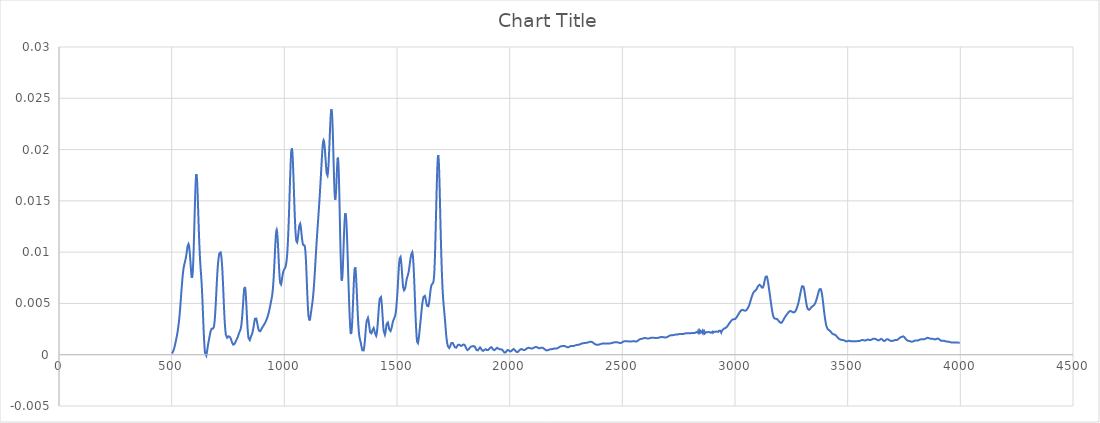
| Category | Series 0 |
|---|---|
| 3997.70514 | 0.001 |
| 3995.77668 | 0.001 |
| 3993.84822 | 0.001 |
| 3991.91975 | 0.001 |
| 3989.99129 | 0.001 |
| 3988.06283 | 0.001 |
| 3986.13436 | 0.001 |
| 3984.2059 | 0.001 |
| 3982.27743 | 0.001 |
| 3980.34897 | 0.001 |
| 3978.42051 | 0.001 |
| 3976.49204 | 0.001 |
| 3974.56358 | 0.001 |
| 3972.63512 | 0.001 |
| 3970.70665 | 0.001 |
| 3968.77819 | 0.001 |
| 3966.84973 | 0.001 |
| 3964.92126 | 0.001 |
| 3962.9928 | 0.001 |
| 3961.06433 | 0.001 |
| 3959.13587 | 0.001 |
| 3957.20741 | 0.001 |
| 3955.27894 | 0.001 |
| 3953.35048 | 0.001 |
| 3951.42202 | 0.001 |
| 3949.49355 | 0.001 |
| 3947.56509 | 0.001 |
| 3945.63663 | 0.001 |
| 3943.70816 | 0.001 |
| 3941.7797 | 0.001 |
| 3939.85123 | 0.001 |
| 3937.92277 | 0.001 |
| 3935.99431 | 0.001 |
| 3934.06584 | 0.001 |
| 3932.13738 | 0.001 |
| 3930.20892 | 0.001 |
| 3928.28045 | 0.001 |
| 3926.35199 | 0.001 |
| 3924.42353 | 0.001 |
| 3922.49506 | 0.001 |
| 3920.5666 | 0.001 |
| 3918.63813 | 0.001 |
| 3916.70967 | 0.001 |
| 3914.78121 | 0.001 |
| 3912.85274 | 0.001 |
| 3910.92428 | 0.001 |
| 3908.99582 | 0.001 |
| 3907.06735 | 0.001 |
| 3905.13889 | 0.002 |
| 3903.21043 | 0.002 |
| 3901.28196 | 0.002 |
| 3899.3535 | 0.002 |
| 3897.42503 | 0.002 |
| 3895.49657 | 0.002 |
| 3893.56811 | 0.002 |
| 3891.63964 | 0.002 |
| 3889.71118 | 0.001 |
| 3887.78272 | 0.001 |
| 3885.85425 | 0.001 |
| 3883.92579 | 0.002 |
| 3881.99733 | 0.002 |
| 3880.06886 | 0.002 |
| 3878.1404 | 0.002 |
| 3876.21193 | 0.002 |
| 3874.28347 | 0.002 |
| 3872.35501 | 0.002 |
| 3870.42654 | 0.002 |
| 3868.49808 | 0.002 |
| 3866.56962 | 0.002 |
| 3864.64115 | 0.002 |
| 3862.71269 | 0.002 |
| 3860.78422 | 0.002 |
| 3858.85576 | 0.002 |
| 3856.9273 | 0.002 |
| 3854.99883 | 0.002 |
| 3853.07037 | 0.002 |
| 3851.14191 | 0.002 |
| 3849.21344 | 0.002 |
| 3847.28498 | 0.002 |
| 3845.35652 | 0.002 |
| 3843.42805 | 0.002 |
| 3841.49959 | 0.002 |
| 3839.57112 | 0.002 |
| 3837.64266 | 0.001 |
| 3835.7142 | 0.001 |
| 3833.78573 | 0.001 |
| 3831.85727 | 0.001 |
| 3829.92881 | 0.002 |
| 3828.00034 | 0.002 |
| 3826.07188 | 0.002 |
| 3824.14342 | 0.001 |
| 3822.21495 | 0.001 |
| 3820.28649 | 0.001 |
| 3818.35802 | 0.001 |
| 3816.42956 | 0.001 |
| 3814.5011 | 0.001 |
| 3812.57263 | 0.001 |
| 3810.64417 | 0.001 |
| 3808.71571 | 0.001 |
| 3806.78724 | 0.001 |
| 3804.85878 | 0.001 |
| 3802.93032 | 0.001 |
| 3801.00185 | 0.001 |
| 3799.07339 | 0.001 |
| 3797.14492 | 0.001 |
| 3795.21646 | 0.001 |
| 3793.288 | 0.001 |
| 3791.35953 | 0.001 |
| 3789.43107 | 0.001 |
| 3787.50261 | 0.001 |
| 3785.57414 | 0.001 |
| 3783.64568 | 0.001 |
| 3781.71722 | 0.001 |
| 3779.78875 | 0.001 |
| 3777.86029 | 0.001 |
| 3775.93182 | 0.001 |
| 3774.00336 | 0.001 |
| 3772.0749 | 0.001 |
| 3770.14643 | 0.001 |
| 3768.21797 | 0.001 |
| 3766.28951 | 0.001 |
| 3764.36104 | 0.001 |
| 3762.43258 | 0.001 |
| 3760.50412 | 0.001 |
| 3758.57565 | 0.002 |
| 3756.64719 | 0.002 |
| 3754.71872 | 0.002 |
| 3752.79026 | 0.002 |
| 3750.8618 | 0.002 |
| 3748.93333 | 0.002 |
| 3747.00487 | 0.002 |
| 3745.07641 | 0.002 |
| 3743.14794 | 0.002 |
| 3741.21948 | 0.002 |
| 3739.29102 | 0.002 |
| 3737.36255 | 0.002 |
| 3735.43409 | 0.002 |
| 3733.50562 | 0.002 |
| 3731.57716 | 0.002 |
| 3729.6487 | 0.002 |
| 3727.72023 | 0.002 |
| 3725.79177 | 0.002 |
| 3723.86331 | 0.001 |
| 3721.93484 | 0.001 |
| 3720.00638 | 0.001 |
| 3718.07791 | 0.001 |
| 3716.14945 | 0.001 |
| 3714.22099 | 0.001 |
| 3712.29252 | 0.001 |
| 3710.36406 | 0.001 |
| 3708.4356 | 0.001 |
| 3706.50713 | 0.001 |
| 3704.57867 | 0.001 |
| 3702.65021 | 0.001 |
| 3700.72174 | 0.001 |
| 3698.79328 | 0.001 |
| 3696.86481 | 0.001 |
| 3694.93635 | 0.001 |
| 3693.00789 | 0.001 |
| 3691.07942 | 0.001 |
| 3689.15096 | 0.001 |
| 3687.2225 | 0.001 |
| 3685.29403 | 0.001 |
| 3683.36557 | 0.001 |
| 3681.43711 | 0.001 |
| 3679.50864 | 0.001 |
| 3677.58018 | 0.002 |
| 3675.65171 | 0.002 |
| 3673.72325 | 0.002 |
| 3671.79479 | 0.001 |
| 3669.86632 | 0.001 |
| 3667.93786 | 0.001 |
| 3666.0094 | 0.001 |
| 3664.08093 | 0.001 |
| 3662.15247 | 0.001 |
| 3660.22401 | 0.001 |
| 3658.29554 | 0.001 |
| 3656.36708 | 0.001 |
| 3654.43861 | 0.001 |
| 3652.51015 | 0.002 |
| 3650.58169 | 0.002 |
| 3648.65322 | 0.002 |
| 3646.72476 | 0.002 |
| 3644.7963 | 0.002 |
| 3642.86783 | 0.001 |
| 3640.93937 | 0.001 |
| 3639.01091 | 0.001 |
| 3637.08244 | 0.001 |
| 3635.15398 | 0.001 |
| 3633.22551 | 0.001 |
| 3631.29705 | 0.001 |
| 3629.36859 | 0.001 |
| 3627.44012 | 0.001 |
| 3625.51166 | 0.002 |
| 3623.5832 | 0.002 |
| 3621.65473 | 0.002 |
| 3619.72627 | 0.002 |
| 3617.79781 | 0.002 |
| 3615.86934 | 0.002 |
| 3613.94088 | 0.002 |
| 3612.01241 | 0.002 |
| 3610.08395 | 0.002 |
| 3608.15549 | 0.002 |
| 3606.22702 | 0.001 |
| 3604.29856 | 0.001 |
| 3602.3701 | 0.001 |
| 3600.44163 | 0.001 |
| 3598.51317 | 0.001 |
| 3596.58471 | 0.001 |
| 3594.65624 | 0.001 |
| 3592.72778 | 0.001 |
| 3590.79931 | 0.001 |
| 3588.87085 | 0.001 |
| 3586.94239 | 0.001 |
| 3585.01392 | 0.001 |
| 3583.08546 | 0.001 |
| 3581.157 | 0.001 |
| 3579.22853 | 0.001 |
| 3577.30007 | 0.001 |
| 3575.3716 | 0.001 |
| 3573.44314 | 0.001 |
| 3571.51468 | 0.001 |
| 3569.58621 | 0.001 |
| 3567.65775 | 0.001 |
| 3565.72929 | 0.001 |
| 3563.80082 | 0.001 |
| 3561.87236 | 0.001 |
| 3559.9439 | 0.001 |
| 3558.01543 | 0.001 |
| 3556.08697 | 0.001 |
| 3554.1585 | 0.001 |
| 3552.23004 | 0.001 |
| 3550.30158 | 0.001 |
| 3548.37311 | 0.001 |
| 3546.44465 | 0.001 |
| 3544.51619 | 0.001 |
| 3542.58772 | 0.001 |
| 3540.65926 | 0.001 |
| 3538.7308 | 0.001 |
| 3536.80233 | 0.001 |
| 3534.87387 | 0.001 |
| 3532.9454 | 0.001 |
| 3531.01694 | 0.001 |
| 3529.08848 | 0.001 |
| 3527.16001 | 0.001 |
| 3525.23155 | 0.001 |
| 3523.30309 | 0.001 |
| 3521.37462 | 0.001 |
| 3519.44616 | 0.001 |
| 3517.5177 | 0.001 |
| 3515.58923 | 0.001 |
| 3513.66077 | 0.001 |
| 3511.7323 | 0.001 |
| 3509.80384 | 0.001 |
| 3507.87538 | 0.001 |
| 3505.94691 | 0.001 |
| 3504.01845 | 0.001 |
| 3502.08999 | 0.001 |
| 3500.16152 | 0.001 |
| 3498.23306 | 0.001 |
| 3496.3046 | 0.001 |
| 3494.37613 | 0.001 |
| 3492.44767 | 0.001 |
| 3490.5192 | 0.001 |
| 3488.59074 | 0.001 |
| 3486.66228 | 0.001 |
| 3484.73381 | 0.001 |
| 3482.80535 | 0.001 |
| 3480.87689 | 0.001 |
| 3478.94842 | 0.001 |
| 3477.01996 | 0.001 |
| 3475.0915 | 0.001 |
| 3473.16303 | 0.001 |
| 3471.23457 | 0.001 |
| 3469.3061 | 0.001 |
| 3467.37764 | 0.001 |
| 3465.44918 | 0.001 |
| 3463.52071 | 0.002 |
| 3461.59225 | 0.002 |
| 3459.66379 | 0.002 |
| 3457.73532 | 0.002 |
| 3455.80686 | 0.002 |
| 3453.8784 | 0.002 |
| 3451.94993 | 0.002 |
| 3450.02147 | 0.002 |
| 3448.093 | 0.002 |
| 3446.16454 | 0.002 |
| 3444.23608 | 0.002 |
| 3442.30761 | 0.002 |
| 3440.37915 | 0.002 |
| 3438.45069 | 0.002 |
| 3436.52222 | 0.002 |
| 3434.59376 | 0.002 |
| 3432.66529 | 0.002 |
| 3430.73683 | 0.002 |
| 3428.80837 | 0.002 |
| 3426.8799 | 0.002 |
| 3424.95144 | 0.002 |
| 3423.02298 | 0.002 |
| 3421.09451 | 0.002 |
| 3419.16605 | 0.002 |
| 3417.23759 | 0.002 |
| 3415.30912 | 0.002 |
| 3413.38066 | 0.002 |
| 3411.45219 | 0.002 |
| 3409.52373 | 0.003 |
| 3407.59527 | 0.003 |
| 3405.6668 | 0.003 |
| 3403.73834 | 0.003 |
| 3401.80988 | 0.003 |
| 3399.88141 | 0.003 |
| 3397.95295 | 0.004 |
| 3396.02449 | 0.004 |
| 3394.09602 | 0.004 |
| 3392.16756 | 0.005 |
| 3390.23909 | 0.005 |
| 3388.31063 | 0.006 |
| 3386.38217 | 0.006 |
| 3384.4537 | 0.006 |
| 3382.52524 | 0.006 |
| 3380.59678 | 0.006 |
| 3378.66831 | 0.006 |
| 3376.73985 | 0.006 |
| 3374.81139 | 0.006 |
| 3372.88292 | 0.006 |
| 3370.95446 | 0.006 |
| 3369.02599 | 0.006 |
| 3367.09753 | 0.006 |
| 3365.16907 | 0.006 |
| 3363.2406 | 0.006 |
| 3361.31214 | 0.005 |
| 3359.38368 | 0.005 |
| 3357.45521 | 0.005 |
| 3355.52675 | 0.005 |
| 3353.59829 | 0.005 |
| 3351.66982 | 0.005 |
| 3349.74136 | 0.005 |
| 3347.81289 | 0.005 |
| 3345.88443 | 0.005 |
| 3343.95597 | 0.005 |
| 3342.0275 | 0.005 |
| 3340.09904 | 0.005 |
| 3338.17058 | 0.005 |
| 3336.24211 | 0.005 |
| 3334.31365 | 0.004 |
| 3332.38519 | 0.004 |
| 3330.45672 | 0.004 |
| 3328.52826 | 0.004 |
| 3326.59979 | 0.004 |
| 3324.67133 | 0.004 |
| 3322.74287 | 0.004 |
| 3320.8144 | 0.005 |
| 3318.88594 | 0.005 |
| 3316.95748 | 0.005 |
| 3315.02901 | 0.005 |
| 3313.10055 | 0.006 |
| 3311.17208 | 0.006 |
| 3309.24362 | 0.006 |
| 3307.31516 | 0.006 |
| 3305.38669 | 0.007 |
| 3303.45823 | 0.007 |
| 3301.52977 | 0.007 |
| 3299.6013 | 0.007 |
| 3297.67284 | 0.007 |
| 3295.74438 | 0.007 |
| 3293.81591 | 0.006 |
| 3291.88745 | 0.006 |
| 3289.95898 | 0.006 |
| 3288.03052 | 0.006 |
| 3286.10206 | 0.006 |
| 3284.17359 | 0.005 |
| 3282.24513 | 0.005 |
| 3280.31667 | 0.005 |
| 3278.3882 | 0.005 |
| 3276.45974 | 0.005 |
| 3274.53128 | 0.005 |
| 3272.60281 | 0.004 |
| 3270.67435 | 0.004 |
| 3268.74588 | 0.004 |
| 3266.81742 | 0.004 |
| 3264.88896 | 0.004 |
| 3262.96049 | 0.004 |
| 3261.03203 | 0.004 |
| 3259.10357 | 0.004 |
| 3257.1751 | 0.004 |
| 3255.24664 | 0.004 |
| 3253.31818 | 0.004 |
| 3251.38971 | 0.004 |
| 3249.46125 | 0.004 |
| 3247.53278 | 0.004 |
| 3245.60432 | 0.004 |
| 3243.67586 | 0.004 |
| 3241.74739 | 0.004 |
| 3239.81893 | 0.004 |
| 3237.89047 | 0.004 |
| 3235.962 | 0.004 |
| 3234.03354 | 0.004 |
| 3232.10508 | 0.004 |
| 3230.17661 | 0.004 |
| 3228.24815 | 0.004 |
| 3226.31968 | 0.004 |
| 3224.39122 | 0.004 |
| 3222.46276 | 0.004 |
| 3220.53429 | 0.004 |
| 3218.60583 | 0.004 |
| 3216.67737 | 0.003 |
| 3214.7489 | 0.003 |
| 3212.82044 | 0.003 |
| 3210.89198 | 0.003 |
| 3208.96351 | 0.003 |
| 3207.03505 | 0.003 |
| 3205.10658 | 0.003 |
| 3203.17812 | 0.003 |
| 3201.24966 | 0.003 |
| 3199.32119 | 0.003 |
| 3197.39273 | 0.003 |
| 3195.46427 | 0.003 |
| 3193.5358 | 0.003 |
| 3191.60734 | 0.003 |
| 3189.67888 | 0.003 |
| 3187.75041 | 0.003 |
| 3185.82195 | 0.003 |
| 3183.89348 | 0.004 |
| 3181.96502 | 0.004 |
| 3180.03656 | 0.004 |
| 3178.10809 | 0.004 |
| 3176.17963 | 0.004 |
| 3174.25117 | 0.004 |
| 3172.3227 | 0.004 |
| 3170.39424 | 0.004 |
| 3168.46577 | 0.004 |
| 3166.53731 | 0.004 |
| 3164.60885 | 0.004 |
| 3162.68038 | 0.005 |
| 3160.75192 | 0.005 |
| 3158.82346 | 0.005 |
| 3156.89499 | 0.006 |
| 3154.96653 | 0.006 |
| 3153.03807 | 0.006 |
| 3151.1096 | 0.006 |
| 3149.18114 | 0.007 |
| 3147.25267 | 0.007 |
| 3145.32421 | 0.007 |
| 3143.39575 | 0.007 |
| 3141.46728 | 0.008 |
| 3139.53882 | 0.008 |
| 3137.61036 | 0.008 |
| 3135.68189 | 0.008 |
| 3133.75343 | 0.007 |
| 3131.82497 | 0.007 |
| 3129.8965 | 0.007 |
| 3127.96804 | 0.007 |
| 3126.03957 | 0.007 |
| 3124.11111 | 0.007 |
| 3122.18265 | 0.007 |
| 3120.25418 | 0.007 |
| 3118.32572 | 0.007 |
| 3116.39726 | 0.007 |
| 3114.46879 | 0.007 |
| 3112.54033 | 0.007 |
| 3110.61187 | 0.007 |
| 3108.6834 | 0.007 |
| 3106.75494 | 0.007 |
| 3104.82647 | 0.007 |
| 3102.89801 | 0.007 |
| 3100.96955 | 0.007 |
| 3099.04108 | 0.007 |
| 3097.11262 | 0.006 |
| 3095.18416 | 0.006 |
| 3093.25569 | 0.006 |
| 3091.32723 | 0.006 |
| 3089.39877 | 0.006 |
| 3087.4703 | 0.006 |
| 3085.54184 | 0.006 |
| 3083.61337 | 0.006 |
| 3081.68491 | 0.006 |
| 3079.75645 | 0.006 |
| 3077.82798 | 0.006 |
| 3075.89952 | 0.006 |
| 3073.97106 | 0.006 |
| 3072.04259 | 0.005 |
| 3070.11413 | 0.005 |
| 3068.18567 | 0.005 |
| 3066.2572 | 0.005 |
| 3064.32874 | 0.005 |
| 3062.40027 | 0.005 |
| 3060.47181 | 0.005 |
| 3058.54335 | 0.005 |
| 3056.61488 | 0.005 |
| 3054.68642 | 0.004 |
| 3052.75796 | 0.004 |
| 3050.82949 | 0.004 |
| 3048.90103 | 0.004 |
| 3046.97257 | 0.004 |
| 3045.0441 | 0.004 |
| 3043.11564 | 0.004 |
| 3041.18717 | 0.004 |
| 3039.25871 | 0.004 |
| 3037.33025 | 0.004 |
| 3035.40178 | 0.004 |
| 3033.47332 | 0.004 |
| 3031.54486 | 0.004 |
| 3029.61639 | 0.004 |
| 3027.68793 | 0.004 |
| 3025.75946 | 0.004 |
| 3023.831 | 0.004 |
| 3021.90254 | 0.004 |
| 3019.97407 | 0.004 |
| 3018.04561 | 0.004 |
| 3016.11715 | 0.004 |
| 3014.18868 | 0.004 |
| 3012.26022 | 0.004 |
| 3010.33176 | 0.004 |
| 3008.40329 | 0.004 |
| 3006.47483 | 0.004 |
| 3004.54636 | 0.004 |
| 3002.6179 | 0.004 |
| 3000.68944 | 0.003 |
| 2998.76097 | 0.003 |
| 2996.83251 | 0.003 |
| 2994.90405 | 0.003 |
| 2992.97558 | 0.003 |
| 2991.04712 | 0.003 |
| 2989.11866 | 0.003 |
| 2987.19019 | 0.003 |
| 2985.26173 | 0.003 |
| 2983.33326 | 0.003 |
| 2981.4048 | 0.003 |
| 2979.47634 | 0.003 |
| 2977.54787 | 0.003 |
| 2975.61941 | 0.003 |
| 2973.69095 | 0.003 |
| 2971.76248 | 0.003 |
| 2969.83402 | 0.003 |
| 2967.90556 | 0.003 |
| 2965.97709 | 0.003 |
| 2964.04863 | 0.003 |
| 2962.12016 | 0.003 |
| 2960.1917 | 0.003 |
| 2958.26324 | 0.003 |
| 2956.33477 | 0.003 |
| 2954.40631 | 0.003 |
| 2952.47785 | 0.003 |
| 2950.54938 | 0.003 |
| 2948.62092 | 0.003 |
| 2946.69246 | 0.002 |
| 2944.76399 | 0.002 |
| 2942.83553 | 0.002 |
| 2940.90706 | 0.002 |
| 2938.9786 | 0.002 |
| 2937.05014 | 0.002 |
| 2935.12167 | 0.002 |
| 2933.19321 | 0.002 |
| 2931.26475 | 0.002 |
| 2929.33628 | 0.002 |
| 2927.40782 | 0.002 |
| 2925.47936 | 0.002 |
| 2923.55089 | 0.002 |
| 2921.62243 | 0.002 |
| 2919.69396 | 0.002 |
| 2917.7655 | 0.002 |
| 2915.83704 | 0.002 |
| 2913.90857 | 0.002 |
| 2911.98011 | 0.002 |
| 2910.05165 | 0.002 |
| 2908.12318 | 0.002 |
| 2906.19472 | 0.002 |
| 2904.26626 | 0.002 |
| 2902.33779 | 0.002 |
| 2900.40933 | 0.002 |
| 2898.48086 | 0.002 |
| 2896.5524 | 0.002 |
| 2894.62394 | 0.002 |
| 2892.69547 | 0.002 |
| 2890.76701 | 0.002 |
| 2888.83855 | 0.002 |
| 2886.91008 | 0.002 |
| 2884.98162 | 0.002 |
| 2883.05315 | 0.002 |
| 2881.12469 | 0.002 |
| 2879.19623 | 0.002 |
| 2877.26776 | 0.002 |
| 2875.3393 | 0.002 |
| 2873.41084 | 0.002 |
| 2871.48237 | 0.002 |
| 2869.55391 | 0.002 |
| 2867.62545 | 0.002 |
| 2865.69698 | 0.002 |
| 2863.76852 | 0.002 |
| 2861.84005 | 0.002 |
| 2859.91159 | 0.002 |
| 2857.98313 | 0.002 |
| 2856.05466 | 0.002 |
| 2854.1262 | 0.002 |
| 2852.19774 | 0.002 |
| 2850.26927 | 0.002 |
| 2848.34081 | 0.002 |
| 2846.41235 | 0.002 |
| 2844.48388 | 0.002 |
| 2842.55542 | 0.002 |
| 2840.62695 | 0.002 |
| 2838.69849 | 0.002 |
| 2836.77003 | 0.002 |
| 2834.84156 | 0.002 |
| 2832.9131 | 0.002 |
| 2830.98464 | 0.002 |
| 2829.05617 | 0.002 |
| 2827.12771 | 0.002 |
| 2825.19925 | 0.002 |
| 2823.27078 | 0.002 |
| 2821.34232 | 0.002 |
| 2819.41385 | 0.002 |
| 2817.48539 | 0.002 |
| 2815.55693 | 0.002 |
| 2813.62846 | 0.002 |
| 2811.7 | 0.002 |
| 2809.77154 | 0.002 |
| 2807.84307 | 0.002 |
| 2805.91461 | 0.002 |
| 2803.98615 | 0.002 |
| 2802.05768 | 0.002 |
| 2800.12922 | 0.002 |
| 2798.20075 | 0.002 |
| 2796.27229 | 0.002 |
| 2794.34383 | 0.002 |
| 2792.41536 | 0.002 |
| 2790.4869 | 0.002 |
| 2788.55844 | 0.002 |
| 2786.62997 | 0.002 |
| 2784.70151 | 0.002 |
| 2782.77305 | 0.002 |
| 2780.84458 | 0.002 |
| 2778.91612 | 0.002 |
| 2776.98765 | 0.002 |
| 2775.05919 | 0.002 |
| 2773.13073 | 0.002 |
| 2771.20226 | 0.002 |
| 2769.2738 | 0.002 |
| 2767.34534 | 0.002 |
| 2765.41687 | 0.002 |
| 2763.48841 | 0.002 |
| 2761.55995 | 0.002 |
| 2759.63148 | 0.002 |
| 2757.70302 | 0.002 |
| 2755.77455 | 0.002 |
| 2753.84609 | 0.002 |
| 2751.91763 | 0.002 |
| 2749.98916 | 0.002 |
| 2748.0607 | 0.002 |
| 2746.13224 | 0.002 |
| 2744.20377 | 0.002 |
| 2742.27531 | 0.002 |
| 2740.34684 | 0.002 |
| 2738.41838 | 0.002 |
| 2736.48992 | 0.002 |
| 2734.56145 | 0.002 |
| 2732.63299 | 0.002 |
| 2730.70453 | 0.002 |
| 2728.77606 | 0.002 |
| 2726.8476 | 0.002 |
| 2724.91914 | 0.002 |
| 2722.99067 | 0.002 |
| 2721.06221 | 0.002 |
| 2719.13374 | 0.002 |
| 2717.20528 | 0.002 |
| 2715.27682 | 0.002 |
| 2713.34835 | 0.002 |
| 2711.41989 | 0.002 |
| 2709.49143 | 0.002 |
| 2707.56296 | 0.002 |
| 2705.6345 | 0.002 |
| 2703.70604 | 0.002 |
| 2701.77757 | 0.002 |
| 2699.84911 | 0.002 |
| 2697.92064 | 0.002 |
| 2695.99218 | 0.002 |
| 2694.06372 | 0.002 |
| 2692.13525 | 0.002 |
| 2690.20679 | 0.002 |
| 2688.27833 | 0.002 |
| 2686.34986 | 0.002 |
| 2684.4214 | 0.002 |
| 2682.49294 | 0.002 |
| 2680.56447 | 0.002 |
| 2678.63601 | 0.002 |
| 2676.70754 | 0.002 |
| 2674.77908 | 0.002 |
| 2672.85062 | 0.002 |
| 2670.92215 | 0.002 |
| 2668.99369 | 0.002 |
| 2667.06523 | 0.002 |
| 2665.13676 | 0.002 |
| 2663.2083 | 0.002 |
| 2661.27984 | 0.002 |
| 2659.35137 | 0.002 |
| 2657.42291 | 0.002 |
| 2655.49444 | 0.002 |
| 2653.56598 | 0.002 |
| 2651.63752 | 0.002 |
| 2649.70905 | 0.002 |
| 2647.78059 | 0.002 |
| 2645.85213 | 0.002 |
| 2643.92366 | 0.002 |
| 2641.9952 | 0.002 |
| 2640.06674 | 0.002 |
| 2638.13827 | 0.002 |
| 2636.20981 | 0.002 |
| 2634.28134 | 0.002 |
| 2632.35288 | 0.002 |
| 2630.42442 | 0.002 |
| 2628.49595 | 0.002 |
| 2626.56749 | 0.002 |
| 2624.63903 | 0.002 |
| 2622.71056 | 0.002 |
| 2620.7821 | 0.002 |
| 2618.85364 | 0.002 |
| 2616.92517 | 0.002 |
| 2614.99671 | 0.002 |
| 2613.06824 | 0.002 |
| 2611.13978 | 0.002 |
| 2609.21132 | 0.002 |
| 2607.28285 | 0.002 |
| 2605.35439 | 0.002 |
| 2603.42593 | 0.002 |
| 2601.49746 | 0.002 |
| 2599.569 | 0.002 |
| 2597.64053 | 0.002 |
| 2595.71207 | 0.002 |
| 2593.78361 | 0.002 |
| 2591.85514 | 0.002 |
| 2589.92668 | 0.002 |
| 2587.99822 | 0.002 |
| 2586.06975 | 0.002 |
| 2584.14129 | 0.002 |
| 2582.21283 | 0.002 |
| 2580.28436 | 0.002 |
| 2578.3559 | 0.002 |
| 2576.42743 | 0.001 |
| 2574.49897 | 0.001 |
| 2572.57051 | 0.001 |
| 2570.64204 | 0.001 |
| 2568.71358 | 0.001 |
| 2566.78512 | 0.001 |
| 2564.85665 | 0.001 |
| 2562.92819 | 0.001 |
| 2560.99973 | 0.001 |
| 2559.07126 | 0.001 |
| 2557.1428 | 0.001 |
| 2555.21433 | 0.001 |
| 2553.28587 | 0.001 |
| 2551.35741 | 0.001 |
| 2549.42894 | 0.001 |
| 2547.50048 | 0.001 |
| 2545.57202 | 0.001 |
| 2543.64355 | 0.001 |
| 2541.71509 | 0.001 |
| 2539.78663 | 0.001 |
| 2537.85816 | 0.001 |
| 2535.9297 | 0.001 |
| 2534.00123 | 0.001 |
| 2532.07277 | 0.001 |
| 2530.14431 | 0.001 |
| 2528.21584 | 0.001 |
| 2526.28738 | 0.001 |
| 2524.35892 | 0.001 |
| 2522.43045 | 0.001 |
| 2520.50199 | 0.001 |
| 2518.57353 | 0.001 |
| 2516.64506 | 0.001 |
| 2514.7166 | 0.001 |
| 2512.78813 | 0.001 |
| 2510.85967 | 0.001 |
| 2508.93121 | 0.001 |
| 2507.00274 | 0.001 |
| 2505.07428 | 0.001 |
| 2503.14582 | 0.001 |
| 2501.21735 | 0.001 |
| 2499.28889 | 0.001 |
| 2497.36043 | 0.001 |
| 2495.43196 | 0.001 |
| 2493.5035 | 0.001 |
| 2491.57503 | 0.001 |
| 2489.64657 | 0.001 |
| 2487.71811 | 0.001 |
| 2485.78964 | 0.001 |
| 2483.86118 | 0.001 |
| 2481.93272 | 0.001 |
| 2480.00425 | 0.001 |
| 2478.07579 | 0.001 |
| 2476.14733 | 0.001 |
| 2474.21886 | 0.001 |
| 2472.2904 | 0.001 |
| 2470.36193 | 0.001 |
| 2468.43347 | 0.001 |
| 2466.50501 | 0.001 |
| 2464.57654 | 0.001 |
| 2462.64808 | 0.001 |
| 2460.71962 | 0.001 |
| 2458.79115 | 0.001 |
| 2456.86269 | 0.001 |
| 2454.93422 | 0.001 |
| 2453.00576 | 0.001 |
| 2451.0773 | 0.001 |
| 2449.14883 | 0.001 |
| 2447.22037 | 0.001 |
| 2445.29191 | 0.001 |
| 2443.36344 | 0.001 |
| 2441.43498 | 0.001 |
| 2439.50652 | 0.001 |
| 2437.57805 | 0.001 |
| 2435.64959 | 0.001 |
| 2433.72112 | 0.001 |
| 2431.79266 | 0.001 |
| 2429.8642 | 0.001 |
| 2427.93573 | 0.001 |
| 2426.00727 | 0.001 |
| 2424.07881 | 0.001 |
| 2422.15034 | 0.001 |
| 2420.22188 | 0.001 |
| 2418.29342 | 0.001 |
| 2416.36495 | 0.001 |
| 2414.43649 | 0.001 |
| 2412.50802 | 0.001 |
| 2410.57956 | 0.001 |
| 2408.6511 | 0.001 |
| 2406.72263 | 0.001 |
| 2404.79417 | 0.001 |
| 2402.86571 | 0.001 |
| 2400.93724 | 0.001 |
| 2399.00878 | 0.001 |
| 2397.08032 | 0.001 |
| 2395.15185 | 0.001 |
| 2393.22339 | 0.001 |
| 2391.29492 | 0.001 |
| 2389.36646 | 0.001 |
| 2387.438 | 0.001 |
| 2385.50953 | 0.001 |
| 2383.58107 | 0.001 |
| 2381.65261 | 0.001 |
| 2379.72414 | 0.001 |
| 2377.79568 | 0.001 |
| 2375.86722 | 0.001 |
| 2373.93875 | 0.001 |
| 2372.01029 | 0.001 |
| 2370.08182 | 0.001 |
| 2368.15336 | 0.001 |
| 2366.2249 | 0.001 |
| 2364.29643 | 0.001 |
| 2362.36797 | 0.001 |
| 2360.43951 | 0.001 |
| 2358.51104 | 0.001 |
| 2356.58258 | 0.001 |
| 2354.65412 | 0.001 |
| 2352.72565 | 0.001 |
| 2350.79719 | 0.001 |
| 2348.86872 | 0.001 |
| 2346.94026 | 0.001 |
| 2345.0118 | 0.001 |
| 2343.08333 | 0.001 |
| 2341.15487 | 0.001 |
| 2339.22641 | 0.001 |
| 2337.29794 | 0.001 |
| 2335.36948 | 0.001 |
| 2333.44102 | 0.001 |
| 2331.51255 | 0.001 |
| 2329.58409 | 0.001 |
| 2327.65562 | 0.001 |
| 2325.72716 | 0.001 |
| 2323.7987 | 0.001 |
| 2321.87023 | 0.001 |
| 2319.94177 | 0.001 |
| 2318.01331 | 0.001 |
| 2316.08484 | 0.001 |
| 2314.15638 | 0.001 |
| 2312.22791 | 0.001 |
| 2310.29945 | 0.001 |
| 2308.37099 | 0.001 |
| 2306.44252 | 0.001 |
| 2304.51406 | 0.001 |
| 2302.5856 | 0.001 |
| 2300.65713 | 0.001 |
| 2298.72867 | 0.001 |
| 2296.80021 | 0.001 |
| 2294.87174 | 0.001 |
| 2292.94328 | 0.001 |
| 2291.01481 | 0.001 |
| 2289.08635 | 0.001 |
| 2287.15789 | 0.001 |
| 2285.22942 | 0.001 |
| 2283.30096 | 0.001 |
| 2281.3725 | 0.001 |
| 2279.44403 | 0.001 |
| 2277.51557 | 0.001 |
| 2275.58711 | 0.001 |
| 2273.65864 | 0.001 |
| 2271.73018 | 0.001 |
| 2269.80171 | 0.001 |
| 2267.87325 | 0.001 |
| 2265.94479 | 0.001 |
| 2264.01632 | 0.001 |
| 2262.08786 | 0.001 |
| 2260.1594 | 0.001 |
| 2258.23093 | 0.001 |
| 2256.30247 | 0.001 |
| 2254.37401 | 0.001 |
| 2252.44554 | 0.001 |
| 2250.51708 | 0.001 |
| 2248.58861 | 0.001 |
| 2246.66015 | 0.001 |
| 2244.73169 | 0.001 |
| 2242.80322 | 0.001 |
| 2240.87476 | 0.001 |
| 2238.9463 | 0.001 |
| 2237.01783 | 0.001 |
| 2235.08937 | 0.001 |
| 2233.16091 | 0.001 |
| 2231.23244 | 0.001 |
| 2229.30398 | 0.001 |
| 2227.37551 | 0.001 |
| 2225.44705 | 0.001 |
| 2223.51859 | 0.001 |
| 2221.59012 | 0.001 |
| 2219.66166 | 0.001 |
| 2217.7332 | 0.001 |
| 2215.80473 | 0.001 |
| 2213.87627 | 0.001 |
| 2211.94781 | 0.001 |
| 2210.01934 | 0.001 |
| 2208.09088 | 0.001 |
| 2206.16241 | 0.001 |
| 2204.23395 | 0.001 |
| 2202.30549 | 0.001 |
| 2200.37702 | 0.001 |
| 2198.44856 | 0.001 |
| 2196.5201 | 0.001 |
| 2194.59163 | 0.001 |
| 2192.66317 | 0.001 |
| 2190.73471 | 0.001 |
| 2188.80624 | 0.001 |
| 2186.87778 | 0.001 |
| 2184.94931 | 0.001 |
| 2183.02085 | 0.001 |
| 2181.09239 | 0.001 |
| 2179.16392 | 0.001 |
| 2177.23546 | 0.001 |
| 2175.307 | 0 |
| 2173.37853 | 0 |
| 2171.45007 | 0 |
| 2169.5216 | 0 |
| 2167.59314 | 0 |
| 2165.66468 | 0 |
| 2163.73621 | 0 |
| 2161.80775 | 0 |
| 2159.87929 | 0 |
| 2157.95082 | 0 |
| 2156.02236 | 0.001 |
| 2154.0939 | 0.001 |
| 2152.16543 | 0.001 |
| 2150.23697 | 0.001 |
| 2148.3085 | 0.001 |
| 2146.38004 | 0.001 |
| 2144.45158 | 0.001 |
| 2142.52311 | 0.001 |
| 2140.59465 | 0.001 |
| 2138.66619 | 0.001 |
| 2136.73772 | 0.001 |
| 2134.80926 | 0.001 |
| 2132.8808 | 0.001 |
| 2130.95233 | 0.001 |
| 2129.02387 | 0.001 |
| 2127.0954 | 0.001 |
| 2125.16694 | 0.001 |
| 2123.23848 | 0.001 |
| 2121.31001 | 0.001 |
| 2119.38155 | 0.001 |
| 2117.45309 | 0.001 |
| 2115.52462 | 0.001 |
| 2113.59616 | 0.001 |
| 2111.6677 | 0.001 |
| 2109.73923 | 0.001 |
| 2107.81077 | 0.001 |
| 2105.8823 | 0.001 |
| 2103.95384 | 0.001 |
| 2102.02538 | 0.001 |
| 2100.09691 | 0.001 |
| 2098.16845 | 0.001 |
| 2096.23999 | 0.001 |
| 2094.31152 | 0.001 |
| 2092.38306 | 0.001 |
| 2090.4546 | 0.001 |
| 2088.52613 | 0.001 |
| 2086.59767 | 0.001 |
| 2084.6692 | 0.001 |
| 2082.74074 | 0.001 |
| 2080.81228 | 0.001 |
| 2078.88381 | 0.001 |
| 2076.95535 | 0.001 |
| 2075.02689 | 0.001 |
| 2073.09842 | 0.001 |
| 2071.16996 | 0.001 |
| 2069.2415 | 0 |
| 2067.31303 | 0 |
| 2065.38457 | 0 |
| 2063.4561 | 0 |
| 2061.52764 | 0 |
| 2059.59918 | 0 |
| 2057.67071 | 0.001 |
| 2055.74225 | 0.001 |
| 2053.81379 | 0.001 |
| 2051.88532 | 0.001 |
| 2049.95686 | 0.001 |
| 2048.0284 | 0.001 |
| 2046.09993 | 0 |
| 2044.17147 | 0 |
| 2042.243 | 0 |
| 2040.31454 | 0 |
| 2038.38608 | 0 |
| 2036.45761 | 0 |
| 2034.52915 | 0 |
| 2032.60069 | 0 |
| 2030.67222 | 0 |
| 2028.74376 | 0 |
| 2026.81529 | 0 |
| 2024.88683 | 0 |
| 2022.95837 | 0 |
| 2021.0299 | 0.001 |
| 2019.10144 | 0.001 |
| 2017.17298 | 0.001 |
| 2015.24451 | 0.001 |
| 2013.31605 | 0.001 |
| 2011.38759 | 0 |
| 2009.45912 | 0 |
| 2007.53066 | 0 |
| 2005.60219 | 0 |
| 2003.67373 | 0 |
| 2001.74527 | 0 |
| 1999.8168 | 0 |
| 1997.88834 | 0 |
| 1995.95988 | 0 |
| 1994.03141 | 0 |
| 1992.10295 | 0 |
| 1990.17449 | 0 |
| 1988.24602 | 0 |
| 1986.31756 | 0 |
| 1984.38909 | 0 |
| 1982.46063 | 0 |
| 1980.53217 | 0 |
| 1978.6037 | 0 |
| 1976.67524 | 0 |
| 1974.74678 | 0 |
| 1972.81831 | 0 |
| 1970.88985 | 0 |
| 1968.96139 | 0 |
| 1967.03292 | 0 |
| 1965.10446 | 0.001 |
| 1963.17599 | 0.001 |
| 1961.24753 | 0.001 |
| 1959.31907 | 0.001 |
| 1957.3906 | 0.001 |
| 1955.46214 | 0.001 |
| 1953.53368 | 0.001 |
| 1951.60521 | 0.001 |
| 1949.67675 | 0.001 |
| 1947.74829 | 0.001 |
| 1945.81982 | 0.001 |
| 1943.89136 | 0.001 |
| 1941.96289 | 0.001 |
| 1940.03443 | 0.001 |
| 1938.10597 | 0.001 |
| 1936.1775 | 0.001 |
| 1934.24904 | 0 |
| 1932.32058 | 0 |
| 1930.39211 | 0 |
| 1928.46365 | 0 |
| 1926.53519 | 0.001 |
| 1924.60672 | 0.001 |
| 1922.67826 | 0.001 |
| 1920.74979 | 0.001 |
| 1918.82133 | 0.001 |
| 1916.89287 | 0.001 |
| 1914.9644 | 0.001 |
| 1913.03594 | 0.001 |
| 1911.10748 | 0.001 |
| 1909.17901 | 0.001 |
| 1907.25055 | 0.001 |
| 1905.32209 | 0 |
| 1903.39362 | 0 |
| 1901.46516 | 0 |
| 1899.53669 | 0 |
| 1897.60823 | 0 |
| 1895.67977 | 0.001 |
| 1893.7513 | 0.001 |
| 1891.82284 | 0.001 |
| 1889.89438 | 0.001 |
| 1887.96591 | 0 |
| 1886.03745 | 0 |
| 1884.10898 | 0 |
| 1882.18052 | 0 |
| 1880.25206 | 0 |
| 1878.32359 | 0 |
| 1876.39513 | 0 |
| 1874.46667 | 0.001 |
| 1872.5382 | 0.001 |
| 1870.60974 | 0.001 |
| 1868.68128 | 0.001 |
| 1866.75281 | 0.001 |
| 1864.82435 | 0.001 |
| 1862.89588 | 0.001 |
| 1860.96742 | 0 |
| 1859.03896 | 0 |
| 1857.11049 | 0 |
| 1855.18203 | 0 |
| 1853.25357 | 0 |
| 1851.3251 | 0.001 |
| 1849.39664 | 0.001 |
| 1847.46818 | 0.001 |
| 1845.53971 | 0.001 |
| 1843.61125 | 0.001 |
| 1841.68278 | 0.001 |
| 1839.75432 | 0.001 |
| 1837.82586 | 0.001 |
| 1835.89739 | 0.001 |
| 1833.96893 | 0.001 |
| 1832.04047 | 0.001 |
| 1830.112 | 0.001 |
| 1828.18354 | 0.001 |
| 1826.25508 | 0.001 |
| 1824.32661 | 0.001 |
| 1822.39815 | 0.001 |
| 1820.46968 | 0.001 |
| 1818.54122 | 0.001 |
| 1816.61276 | 0 |
| 1814.68429 | 0 |
| 1812.75583 | 0 |
| 1810.82737 | 0 |
| 1808.8989 | 0.001 |
| 1806.97044 | 0.001 |
| 1805.04198 | 0.001 |
| 1803.11351 | 0.001 |
| 1801.18505 | 0.001 |
| 1799.25658 | 0.001 |
| 1797.32812 | 0.001 |
| 1795.39966 | 0.001 |
| 1793.47119 | 0.001 |
| 1791.54273 | 0.001 |
| 1789.61427 | 0.001 |
| 1787.6858 | 0.001 |
| 1785.75734 | 0.001 |
| 1783.82888 | 0.001 |
| 1781.90041 | 0.001 |
| 1779.97195 | 0.001 |
| 1778.04348 | 0.001 |
| 1776.11502 | 0.001 |
| 1774.18656 | 0.001 |
| 1772.25809 | 0.001 |
| 1770.32963 | 0.001 |
| 1768.40117 | 0.001 |
| 1766.4727 | 0.001 |
| 1764.54424 | 0.001 |
| 1762.61578 | 0.001 |
| 1760.68731 | 0.001 |
| 1758.75885 | 0.001 |
| 1756.83038 | 0.001 |
| 1754.90192 | 0.001 |
| 1752.97346 | 0.001 |
| 1751.04499 | 0.001 |
| 1749.11653 | 0.001 |
| 1747.18807 | 0.001 |
| 1745.2596 | 0.001 |
| 1743.33114 | 0.001 |
| 1741.40267 | 0.001 |
| 1739.47421 | 0.001 |
| 1737.54575 | 0.001 |
| 1735.61728 | 0.001 |
| 1733.68882 | 0.001 |
| 1731.76036 | 0.001 |
| 1729.83189 | 0.001 |
| 1727.90343 | 0.001 |
| 1725.97497 | 0.001 |
| 1724.0465 | 0.001 |
| 1722.11804 | 0.001 |
| 1720.18957 | 0.002 |
| 1718.26111 | 0.002 |
| 1716.33265 | 0.002 |
| 1714.40418 | 0.003 |
| 1712.47572 | 0.004 |
| 1710.54726 | 0.004 |
| 1708.61879 | 0.004 |
| 1706.69033 | 0.005 |
| 1704.76187 | 0.005 |
| 1702.8334 | 0.006 |
| 1700.90494 | 0.007 |
| 1698.97647 | 0.008 |
| 1697.04801 | 0.009 |
| 1695.11955 | 0.011 |
| 1693.19108 | 0.013 |
| 1691.26262 | 0.014 |
| 1689.33416 | 0.016 |
| 1687.40569 | 0.018 |
| 1685.47723 | 0.019 |
| 1683.54877 | 0.019 |
| 1681.6203 | 0.019 |
| 1679.69184 | 0.019 |
| 1677.76337 | 0.017 |
| 1675.83491 | 0.016 |
| 1673.90645 | 0.014 |
| 1671.97798 | 0.013 |
| 1670.04952 | 0.011 |
| 1668.12106 | 0.009 |
| 1666.19259 | 0.008 |
| 1664.26413 | 0.008 |
| 1662.33567 | 0.007 |
| 1660.4072 | 0.007 |
| 1658.47874 | 0.007 |
| 1656.55027 | 0.007 |
| 1654.62181 | 0.007 |
| 1652.69335 | 0.007 |
| 1650.76488 | 0.007 |
| 1648.83642 | 0.006 |
| 1646.90796 | 0.006 |
| 1644.97949 | 0.006 |
| 1643.05103 | 0.005 |
| 1641.12257 | 0.005 |
| 1639.1941 | 0.005 |
| 1637.26564 | 0.005 |
| 1635.33717 | 0.005 |
| 1633.40871 | 0.005 |
| 1631.48025 | 0.005 |
| 1629.55178 | 0.005 |
| 1627.62332 | 0.005 |
| 1625.69486 | 0.006 |
| 1623.76639 | 0.006 |
| 1621.83793 | 0.006 |
| 1619.90946 | 0.006 |
| 1617.981 | 0.006 |
| 1616.05254 | 0.005 |
| 1614.12407 | 0.005 |
| 1612.19561 | 0.005 |
| 1610.26715 | 0.005 |
| 1608.33868 | 0.004 |
| 1606.41022 | 0.004 |
| 1604.48176 | 0.003 |
| 1602.55329 | 0.003 |
| 1600.62483 | 0.002 |
| 1598.69636 | 0.002 |
| 1596.7679 | 0.002 |
| 1594.83944 | 0.001 |
| 1592.91097 | 0.001 |
| 1590.98251 | 0.001 |
| 1589.05405 | 0.001 |
| 1587.12558 | 0.002 |
| 1585.19712 | 0.002 |
| 1583.26866 | 0.003 |
| 1581.34019 | 0.004 |
| 1579.41173 | 0.006 |
| 1577.48326 | 0.007 |
| 1575.5548 | 0.008 |
| 1573.62634 | 0.009 |
| 1571.69787 | 0.009 |
| 1569.76941 | 0.01 |
| 1567.84095 | 0.01 |
| 1565.91248 | 0.01 |
| 1563.98402 | 0.01 |
| 1562.05556 | 0.01 |
| 1560.12709 | 0.009 |
| 1558.19863 | 0.009 |
| 1556.27016 | 0.009 |
| 1554.3417 | 0.008 |
| 1552.41324 | 0.008 |
| 1550.48477 | 0.008 |
| 1548.55631 | 0.008 |
| 1546.62785 | 0.008 |
| 1544.69938 | 0.008 |
| 1542.77092 | 0.007 |
| 1540.84246 | 0.007 |
| 1538.91399 | 0.007 |
| 1536.98553 | 0.007 |
| 1535.05706 | 0.006 |
| 1533.1286 | 0.006 |
| 1531.20014 | 0.006 |
| 1529.27167 | 0.006 |
| 1527.34321 | 0.007 |
| 1525.41475 | 0.007 |
| 1523.48628 | 0.008 |
| 1521.55782 | 0.008 |
| 1519.62936 | 0.009 |
| 1517.70089 | 0.009 |
| 1515.77243 | 0.01 |
| 1513.84396 | 0.01 |
| 1511.9155 | 0.009 |
| 1509.98704 | 0.009 |
| 1508.05857 | 0.008 |
| 1506.13011 | 0.008 |
| 1504.20165 | 0.007 |
| 1502.27318 | 0.006 |
| 1500.34472 | 0.006 |
| 1498.41626 | 0.005 |
| 1496.48779 | 0.005 |
| 1494.55933 | 0.004 |
| 1492.63086 | 0.004 |
| 1490.7024 | 0.004 |
| 1488.77394 | 0.004 |
| 1486.84547 | 0.004 |
| 1484.91701 | 0.003 |
| 1482.98855 | 0.003 |
| 1481.06008 | 0.003 |
| 1479.13162 | 0.003 |
| 1477.20315 | 0.003 |
| 1475.27469 | 0.003 |
| 1473.34623 | 0.002 |
| 1471.41776 | 0.002 |
| 1469.4893 | 0.002 |
| 1467.56084 | 0.002 |
| 1465.63237 | 0.002 |
| 1463.70391 | 0.003 |
| 1461.77545 | 0.003 |
| 1459.84698 | 0.003 |
| 1457.91852 | 0.003 |
| 1455.99005 | 0.003 |
| 1454.06159 | 0.003 |
| 1452.13313 | 0.003 |
| 1450.20466 | 0.002 |
| 1448.2762 | 0.002 |
| 1446.34774 | 0.002 |
| 1444.41927 | 0.002 |
| 1442.49081 | 0.002 |
| 1440.56235 | 0.002 |
| 1438.63388 | 0.003 |
| 1436.70542 | 0.004 |
| 1434.77695 | 0.004 |
| 1432.84849 | 0.005 |
| 1430.92003 | 0.005 |
| 1428.99156 | 0.006 |
| 1427.0631 | 0.006 |
| 1425.13464 | 0.006 |
| 1423.20617 | 0.005 |
| 1421.27771 | 0.005 |
| 1419.34925 | 0.005 |
| 1417.42078 | 0.004 |
| 1415.49232 | 0.003 |
| 1413.56385 | 0.003 |
| 1411.63539 | 0.002 |
| 1409.70693 | 0.002 |
| 1407.77846 | 0.002 |
| 1405.85 | 0.002 |
| 1403.92154 | 0.002 |
| 1401.99307 | 0.002 |
| 1400.06461 | 0.002 |
| 1398.13615 | 0.002 |
| 1396.20768 | 0.003 |
| 1394.27922 | 0.003 |
| 1392.35075 | 0.003 |
| 1390.42229 | 0.002 |
| 1388.49383 | 0.002 |
| 1386.56536 | 0.002 |
| 1384.6369 | 0.002 |
| 1382.70844 | 0.002 |
| 1380.77997 | 0.002 |
| 1378.85151 | 0.002 |
| 1376.92305 | 0.003 |
| 1374.99458 | 0.003 |
| 1373.06612 | 0.003 |
| 1371.13765 | 0.004 |
| 1369.20919 | 0.004 |
| 1367.28073 | 0.004 |
| 1365.35226 | 0.003 |
| 1363.4238 | 0.003 |
| 1361.49534 | 0.002 |
| 1359.56687 | 0.002 |
| 1357.63841 | 0.001 |
| 1355.70995 | 0.001 |
| 1353.78148 | 0.001 |
| 1351.85302 | 0 |
| 1349.92455 | 0 |
| 1347.99609 | 0 |
| 1346.06763 | 0 |
| 1344.13916 | 0.001 |
| 1342.2107 | 0.001 |
| 1340.28224 | 0.001 |
| 1338.35377 | 0.001 |
| 1336.42531 | 0.001 |
| 1334.49684 | 0.002 |
| 1332.56838 | 0.002 |
| 1330.63992 | 0.002 |
| 1328.71145 | 0.003 |
| 1326.78299 | 0.004 |
| 1324.85453 | 0.004 |
| 1322.92606 | 0.005 |
| 1320.9976 | 0.006 |
| 1319.06914 | 0.007 |
| 1317.14067 | 0.008 |
| 1315.21221 | 0.009 |
| 1313.28374 | 0.009 |
| 1311.35528 | 0.008 |
| 1309.42682 | 0.008 |
| 1307.49835 | 0.007 |
| 1305.56989 | 0.005 |
| 1303.64143 | 0.004 |
| 1301.71296 | 0.003 |
| 1299.7845 | 0.003 |
| 1297.85604 | 0.002 |
| 1295.92757 | 0.002 |
| 1293.99911 | 0.002 |
| 1292.07064 | 0.003 |
| 1290.14218 | 0.004 |
| 1288.21372 | 0.005 |
| 1286.28525 | 0.006 |
| 1284.35679 | 0.007 |
| 1282.42833 | 0.009 |
| 1280.49986 | 0.01 |
| 1278.5714 | 0.011 |
| 1276.64294 | 0.012 |
| 1274.71447 | 0.013 |
| 1272.78601 | 0.014 |
| 1270.85754 | 0.014 |
| 1268.92908 | 0.014 |
| 1267.00062 | 0.013 |
| 1265.07215 | 0.012 |
| 1263.14369 | 0.011 |
| 1261.21523 | 0.009 |
| 1259.28676 | 0.008 |
| 1257.3583 | 0.008 |
| 1255.42984 | 0.007 |
| 1253.50137 | 0.008 |
| 1251.57291 | 0.008 |
| 1249.64444 | 0.01 |
| 1247.71598 | 0.012 |
| 1245.78752 | 0.014 |
| 1243.85905 | 0.016 |
| 1241.93059 | 0.018 |
| 1240.00213 | 0.019 |
| 1238.07366 | 0.019 |
| 1236.1452 | 0.019 |
| 1234.21674 | 0.018 |
| 1232.28827 | 0.017 |
| 1230.35981 | 0.016 |
| 1228.43134 | 0.016 |
| 1226.50288 | 0.015 |
| 1224.57442 | 0.015 |
| 1222.64595 | 0.016 |
| 1220.71749 | 0.017 |
| 1218.78903 | 0.019 |
| 1216.86056 | 0.02 |
| 1214.9321 | 0.022 |
| 1213.00364 | 0.023 |
| 1211.07517 | 0.024 |
| 1209.14671 | 0.024 |
| 1207.21824 | 0.024 |
| 1205.28978 | 0.023 |
| 1203.36132 | 0.022 |
| 1201.43285 | 0.021 |
| 1199.50439 | 0.02 |
| 1197.57593 | 0.019 |
| 1195.64746 | 0.018 |
| 1193.719 | 0.018 |
| 1191.79053 | 0.017 |
| 1189.86207 | 0.017 |
| 1187.93361 | 0.018 |
| 1186.00514 | 0.018 |
| 1184.07668 | 0.019 |
| 1182.14822 | 0.019 |
| 1180.21975 | 0.02 |
| 1178.29129 | 0.02 |
| 1176.36283 | 0.021 |
| 1174.43436 | 0.021 |
| 1172.5059 | 0.021 |
| 1170.57743 | 0.02 |
| 1168.64897 | 0.02 |
| 1166.72051 | 0.019 |
| 1164.79204 | 0.018 |
| 1162.86358 | 0.018 |
| 1160.93512 | 0.017 |
| 1159.00665 | 0.016 |
| 1157.07819 | 0.015 |
| 1155.14973 | 0.015 |
| 1153.22126 | 0.014 |
| 1151.2928 | 0.014 |
| 1149.36433 | 0.013 |
| 1147.43587 | 0.012 |
| 1145.50741 | 0.012 |
| 1143.57894 | 0.011 |
| 1141.65048 | 0.01 |
| 1139.72202 | 0.01 |
| 1137.79355 | 0.009 |
| 1135.86509 | 0.008 |
| 1133.93663 | 0.008 |
| 1132.00816 | 0.007 |
| 1130.0797 | 0.006 |
| 1128.15123 | 0.006 |
| 1126.22277 | 0.005 |
| 1124.29431 | 0.005 |
| 1122.36584 | 0.005 |
| 1120.43738 | 0.004 |
| 1118.50892 | 0.004 |
| 1116.58045 | 0.004 |
| 1114.65199 | 0.004 |
| 1112.72353 | 0.003 |
| 1110.79506 | 0.003 |
| 1108.8666 | 0.003 |
| 1106.93813 | 0.004 |
| 1105.00967 | 0.004 |
| 1103.08121 | 0.005 |
| 1101.15274 | 0.006 |
| 1099.22428 | 0.007 |
| 1097.29582 | 0.009 |
| 1095.36735 | 0.009 |
| 1093.43889 | 0.01 |
| 1091.51043 | 0.01 |
| 1089.58196 | 0.011 |
| 1087.6535 | 0.011 |
| 1085.72503 | 0.011 |
| 1083.79657 | 0.011 |
| 1081.86811 | 0.011 |
| 1079.93964 | 0.011 |
| 1078.01118 | 0.011 |
| 1076.08272 | 0.012 |
| 1074.15425 | 0.012 |
| 1072.22579 | 0.013 |
| 1070.29733 | 0.013 |
| 1068.36886 | 0.013 |
| 1066.4404 | 0.013 |
| 1064.51193 | 0.012 |
| 1062.58347 | 0.012 |
| 1060.65501 | 0.012 |
| 1058.72654 | 0.011 |
| 1056.79808 | 0.011 |
| 1054.86962 | 0.011 |
| 1052.94115 | 0.011 |
| 1051.01269 | 0.012 |
| 1049.08422 | 0.012 |
| 1047.15576 | 0.013 |
| 1045.2273 | 0.014 |
| 1043.29883 | 0.015 |
| 1041.37037 | 0.017 |
| 1039.44191 | 0.018 |
| 1037.51344 | 0.019 |
| 1035.58498 | 0.02 |
| 1033.65652 | 0.02 |
| 1031.72805 | 0.02 |
| 1029.79959 | 0.019 |
| 1027.87112 | 0.019 |
| 1025.94266 | 0.017 |
| 1024.0142 | 0.016 |
| 1022.08573 | 0.015 |
| 1020.15727 | 0.013 |
| 1018.22881 | 0.012 |
| 1016.30034 | 0.011 |
| 1014.37188 | 0.01 |
| 1012.44342 | 0.01 |
| 1010.51495 | 0.009 |
| 1008.58649 | 0.009 |
| 1006.65802 | 0.009 |
| 1004.72956 | 0.009 |
| 1002.8011 | 0.008 |
| 1000.87263 | 0.008 |
| 998.94417 | 0.008 |
| 997.01571 | 0.008 |
| 995.08724 | 0.008 |
| 993.15878 | 0.008 |
| 991.23032 | 0.008 |
| 989.30185 | 0.007 |
| 987.37339 | 0.007 |
| 985.44492 | 0.007 |
| 983.51646 | 0.007 |
| 981.588 | 0.007 |
| 979.65953 | 0.007 |
| 977.73107 | 0.008 |
| 975.80261 | 0.009 |
| 973.87414 | 0.01 |
| 971.94568 | 0.011 |
| 970.01722 | 0.011 |
| 968.08875 | 0.012 |
| 966.16029 | 0.012 |
| 964.23182 | 0.012 |
| 962.30336 | 0.012 |
| 960.3749 | 0.011 |
| 958.44643 | 0.01 |
| 956.51797 | 0.009 |
| 954.58951 | 0.008 |
| 952.66104 | 0.008 |
| 950.73258 | 0.007 |
| 948.80412 | 0.006 |
| 946.87565 | 0.006 |
| 944.94719 | 0.006 |
| 943.01872 | 0.005 |
| 941.09026 | 0.005 |
| 939.1618 | 0.005 |
| 937.23333 | 0.005 |
| 935.30487 | 0.005 |
| 933.37641 | 0.004 |
| 931.44794 | 0.004 |
| 929.51948 | 0.004 |
| 927.59102 | 0.004 |
| 925.66255 | 0.004 |
| 923.73409 | 0.004 |
| 921.80562 | 0.003 |
| 919.87716 | 0.003 |
| 917.9487 | 0.003 |
| 916.02023 | 0.003 |
| 914.09177 | 0.003 |
| 912.16331 | 0.003 |
| 910.23484 | 0.003 |
| 908.30638 | 0.003 |
| 906.37791 | 0.003 |
| 904.44945 | 0.003 |
| 902.52099 | 0.003 |
| 900.59252 | 0.003 |
| 898.66406 | 0.003 |
| 896.7356 | 0.002 |
| 894.80713 | 0.002 |
| 892.87867 | 0.002 |
| 890.95021 | 0.002 |
| 889.02174 | 0.002 |
| 887.09328 | 0.002 |
| 885.16481 | 0.002 |
| 883.23635 | 0.003 |
| 881.30789 | 0.003 |
| 879.37942 | 0.003 |
| 877.45096 | 0.003 |
| 875.5225 | 0.004 |
| 873.59403 | 0.004 |
| 871.66557 | 0.004 |
| 869.73711 | 0.004 |
| 867.80864 | 0.003 |
| 865.88018 | 0.003 |
| 863.95171 | 0.003 |
| 862.02325 | 0.003 |
| 860.09479 | 0.002 |
| 858.16632 | 0.002 |
| 856.23786 | 0.002 |
| 854.3094 | 0.002 |
| 852.38093 | 0.002 |
| 850.45247 | 0.002 |
| 848.52401 | 0.002 |
| 846.59554 | 0.001 |
| 844.66708 | 0.001 |
| 842.73861 | 0.001 |
| 840.81015 | 0.002 |
| 838.88169 | 0.002 |
| 836.95322 | 0.003 |
| 835.02476 | 0.003 |
| 833.0963 | 0.004 |
| 831.16783 | 0.005 |
| 829.23937 | 0.006 |
| 827.31091 | 0.006 |
| 825.38244 | 0.007 |
| 823.45398 | 0.007 |
| 821.52551 | 0.006 |
| 819.59705 | 0.006 |
| 817.66859 | 0.005 |
| 815.74012 | 0.005 |
| 813.81166 | 0.004 |
| 811.8832 | 0.003 |
| 809.95473 | 0.003 |
| 808.02627 | 0.003 |
| 806.09781 | 0.002 |
| 804.16934 | 0.002 |
| 802.24088 | 0.002 |
| 800.31241 | 0.002 |
| 798.38395 | 0.002 |
| 796.45549 | 0.002 |
| 794.52702 | 0.002 |
| 792.59856 | 0.002 |
| 790.6701 | 0.002 |
| 788.74163 | 0.002 |
| 786.81317 | 0.001 |
| 784.88471 | 0.001 |
| 782.95624 | 0.001 |
| 781.02778 | 0.001 |
| 779.09931 | 0.001 |
| 777.17085 | 0.001 |
| 775.24239 | 0.001 |
| 773.31392 | 0.001 |
| 771.38546 | 0.001 |
| 769.457 | 0.001 |
| 767.52853 | 0.001 |
| 765.60007 | 0.001 |
| 763.6716 | 0.001 |
| 761.74314 | 0.002 |
| 759.81468 | 0.002 |
| 757.88621 | 0.002 |
| 755.95775 | 0.002 |
| 754.02929 | 0.002 |
| 752.10082 | 0.002 |
| 750.17236 | 0.002 |
| 748.2439 | 0.002 |
| 746.31543 | 0.002 |
| 744.38697 | 0.002 |
| 742.4585 | 0.002 |
| 740.53004 | 0.002 |
| 738.60158 | 0.002 |
| 736.67311 | 0.003 |
| 734.74465 | 0.003 |
| 732.81619 | 0.004 |
| 730.88772 | 0.005 |
| 728.95926 | 0.006 |
| 727.0308 | 0.007 |
| 725.10233 | 0.008 |
| 723.17387 | 0.009 |
| 721.2454 | 0.009 |
| 719.31694 | 0.01 |
| 717.38848 | 0.01 |
| 715.46001 | 0.01 |
| 713.53155 | 0.01 |
| 711.60309 | 0.01 |
| 709.67462 | 0.01 |
| 707.74616 | 0.009 |
| 705.8177 | 0.009 |
| 703.88923 | 0.008 |
| 701.96077 | 0.008 |
| 700.0323 | 0.007 |
| 698.10384 | 0.006 |
| 696.17538 | 0.005 |
| 694.24691 | 0.004 |
| 692.31845 | 0.004 |
| 690.38999 | 0.003 |
| 688.46152 | 0.003 |
| 686.53306 | 0.003 |
| 684.6046 | 0.003 |
| 682.67613 | 0.003 |
| 680.74767 | 0.003 |
| 678.8192 | 0.003 |
| 676.89074 | 0.003 |
| 674.96228 | 0.002 |
| 673.03381 | 0.002 |
| 671.10535 | 0.002 |
| 669.17689 | 0.002 |
| 667.24842 | 0.002 |
| 665.31996 | 0.001 |
| 663.3915 | 0.001 |
| 661.46303 | 0.001 |
| 659.53457 | 0.001 |
| 657.6061 | 0 |
| 655.67764 | 0 |
| 653.74918 | 0 |
| 651.82071 | 0 |
| 649.89225 | 0 |
| 647.96379 | 0 |
| 646.03532 | 0.001 |
| 644.10686 | 0.001 |
| 642.1784 | 0.002 |
| 640.24993 | 0.003 |
| 638.32147 | 0.004 |
| 636.393 | 0.005 |
| 634.46454 | 0.006 |
| 632.53608 | 0.007 |
| 630.60761 | 0.008 |
| 628.67915 | 0.008 |
| 626.75069 | 0.009 |
| 624.82222 | 0.01 |
| 622.89376 | 0.011 |
| 620.96529 | 0.012 |
| 619.03683 | 0.013 |
| 617.10837 | 0.014 |
| 615.1799 | 0.016 |
| 613.25144 | 0.017 |
| 611.32298 | 0.017 |
| 609.39451 | 0.018 |
| 607.46605 | 0.017 |
| 605.53759 | 0.016 |
| 603.60912 | 0.015 |
| 601.68066 | 0.013 |
| 599.75219 | 0.012 |
| 597.82373 | 0.01 |
| 595.89527 | 0.009 |
| 593.9668 | 0.008 |
| 592.03834 | 0.008 |
| 590.10988 | 0.008 |
| 588.18141 | 0.008 |
| 586.25295 | 0.008 |
| 584.32449 | 0.009 |
| 582.39602 | 0.009 |
| 580.46756 | 0.01 |
| 578.53909 | 0.01 |
| 576.61063 | 0.011 |
| 574.68217 | 0.011 |
| 572.7537 | 0.011 |
| 570.82524 | 0.011 |
| 568.89678 | 0.01 |
| 566.96831 | 0.01 |
| 565.03985 | 0.01 |
| 563.11139 | 0.009 |
| 561.18292 | 0.009 |
| 559.25446 | 0.009 |
| 557.32599 | 0.009 |
| 555.39753 | 0.009 |
| 553.46907 | 0.009 |
| 551.5406 | 0.008 |
| 549.61214 | 0.008 |
| 547.68368 | 0.007 |
| 545.75521 | 0.007 |
| 543.82675 | 0.006 |
| 541.89829 | 0.006 |
| 539.96982 | 0.005 |
| 538.04136 | 0.005 |
| 536.11289 | 0.004 |
| 534.18443 | 0.004 |
| 532.25597 | 0.003 |
| 530.3275 | 0.003 |
| 528.39904 | 0.003 |
| 526.47058 | 0.002 |
| 524.54211 | 0.002 |
| 522.61365 | 0.002 |
| 520.68519 | 0.002 |
| 518.75672 | 0.001 |
| 516.82826 | 0.001 |
| 514.89979 | 0.001 |
| 512.97133 | 0.001 |
| 511.04287 | 0.001 |
| 509.1144 | 0 |
| 507.18594 | 0 |
| 505.25748 | 0 |
| 503.32901 | 0 |
| 501.40055 | 0 |
| 499.47209 | 0 |